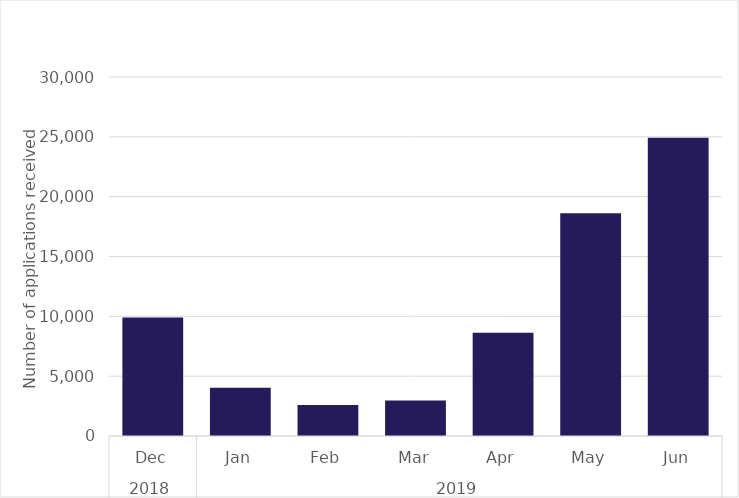
| Category | Series 0 |
|---|---|
| 0 | 9895 |
| 1 | 4025 |
| 2 | 2585 |
| 3 | 2960 |
| 4 | 8620 |
| 5 | 18605 |
| 6 | 24930 |